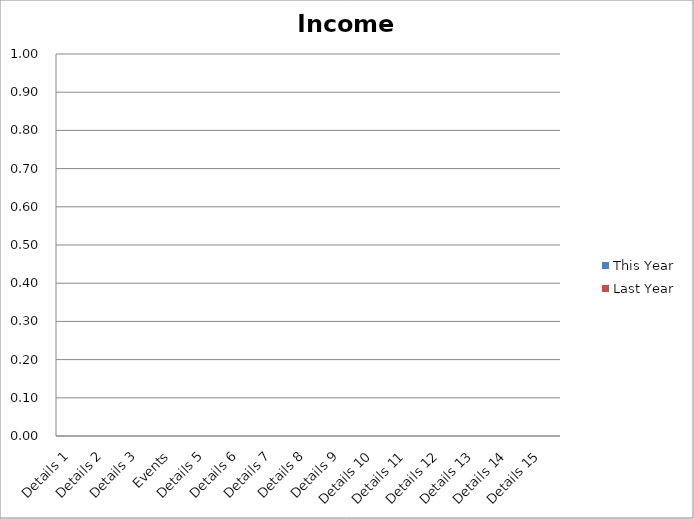
| Category | This Year | Last Year |
|---|---|---|
| Details 1 | 0 | 0 |
| Details 2 | 0 | 0 |
| Details 3 | 0 | 0 |
| Events | 0 | 0 |
| Details 5 | 0 | 0 |
| Details 6 | 0 | 0 |
| Details 7 | 0 | 0 |
| Details 8 | 0 | 0 |
| Details 9 | 0 | 0 |
| Details 10 | 0 | 0 |
| Details 11 | 0 | 0 |
| Details 12 | 0 | 0 |
| Details 13 | 0 | 0 |
| Details 14 | 0 | 0 |
| Details 15 | 0 | 0 |